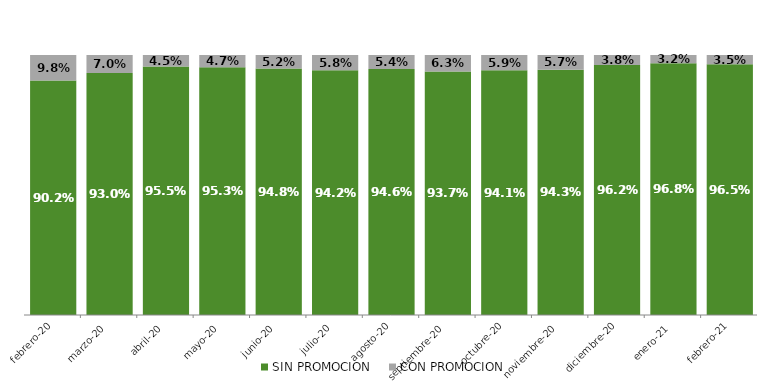
| Category | SIN PROMOCION   | CON PROMOCION   |
|---|---|---|
| 2020-02-01 | 0.902 | 0.098 |
| 2020-03-01 | 0.93 | 0.07 |
| 2020-04-01 | 0.955 | 0.045 |
| 2020-05-01 | 0.953 | 0.047 |
| 2020-06-01 | 0.948 | 0.052 |
| 2020-07-01 | 0.942 | 0.058 |
| 2020-08-01 | 0.946 | 0.054 |
| 2020-09-01 | 0.937 | 0.063 |
| 2020-10-01 | 0.941 | 0.059 |
| 2020-11-01 | 0.943 | 0.057 |
| 2020-12-01 | 0.962 | 0.038 |
| 2021-01-01 | 0.968 | 0.032 |
| 2021-02-01 | 0.965 | 0.035 |